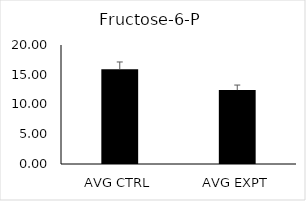
| Category | Series 0 |
|---|---|
| AVG CTRL | 15.919 |
| AVG EXPT | 12.422 |